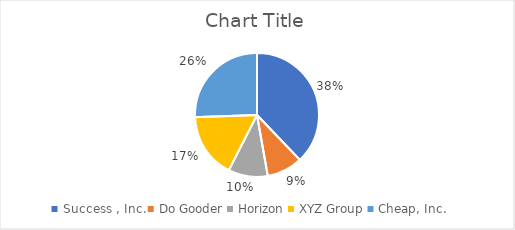
| Category | Series 0 |
|---|---|
| Success , Inc. | 4478 |
| Do Gooder | 1104.8 |
| Horizon | 1218 |
| XYZ Group | 2003.61 |
| Cheap, Inc. | 3021.7 |